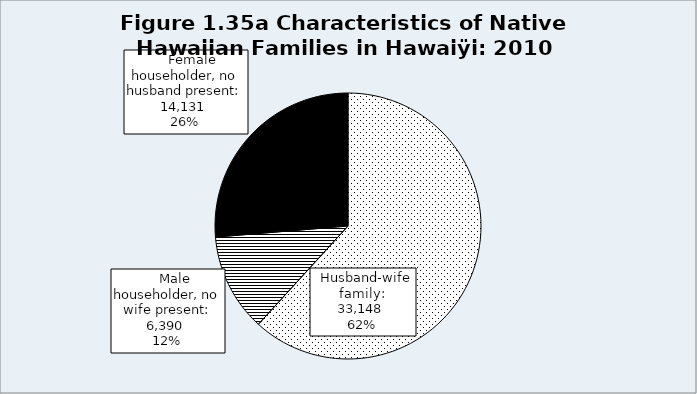
| Category | Series 0 |
|---|---|
|   Husband-wife family: | 33148 |
|     Male householder, no wife present: | 6390 |
|     Female householder, no husband present: | 14131 |